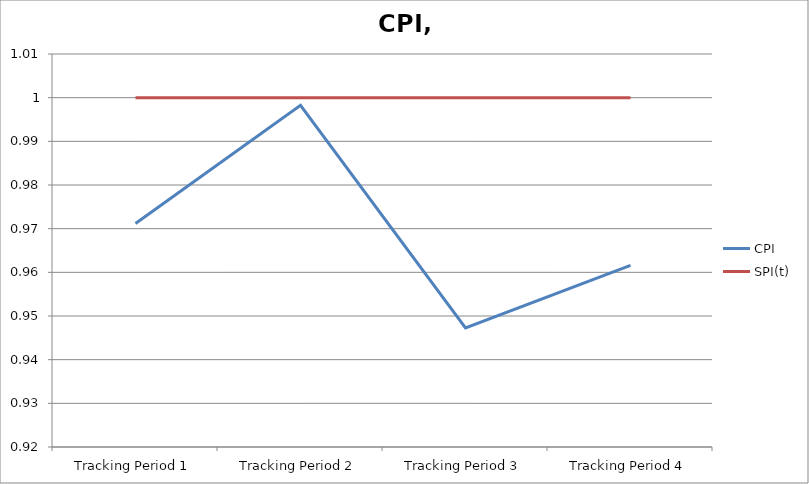
| Category | CPI | SPI(t) |
|---|---|---|
| Tracking Period 1 | 0.971 | 1 |
| Tracking Period 2 | 0.998 | 1 |
| Tracking Period 3 | 0.947 | 1 |
| Tracking Period 4 | 0.962 | 1 |